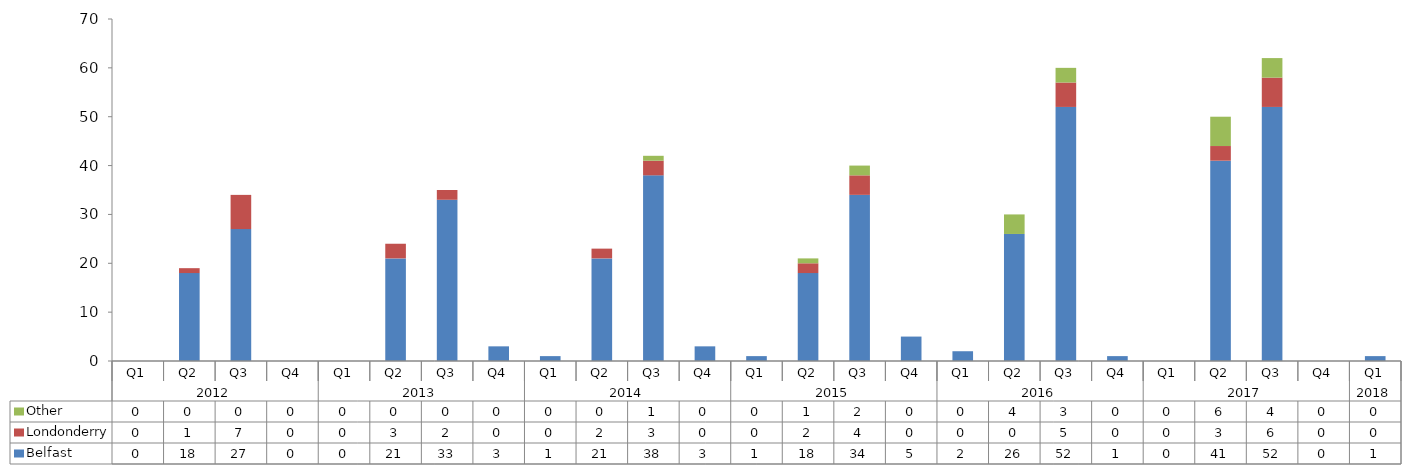
| Category | Belfast | Londonderry | Other |
|---|---|---|---|
| 0 | 0 | 0 | 0 |
| 1 | 18 | 1 | 0 |
| 2 | 27 | 7 | 0 |
| 3 | 0 | 0 | 0 |
| 4 | 0 | 0 | 0 |
| 5 | 21 | 3 | 0 |
| 6 | 33 | 2 | 0 |
| 7 | 3 | 0 | 0 |
| 8 | 1 | 0 | 0 |
| 9 | 21 | 2 | 0 |
| 10 | 38 | 3 | 1 |
| 11 | 3 | 0 | 0 |
| 12 | 1 | 0 | 0 |
| 13 | 18 | 2 | 1 |
| 14 | 34 | 4 | 2 |
| 15 | 5 | 0 | 0 |
| 16 | 2 | 0 | 0 |
| 17 | 26 | 0 | 4 |
| 18 | 52 | 5 | 3 |
| 19 | 1 | 0 | 0 |
| 20 | 0 | 0 | 0 |
| 21 | 41 | 3 | 6 |
| 22 | 52 | 6 | 4 |
| 23 | 0 | 0 | 0 |
| 24 | 1 | 0 | 0 |